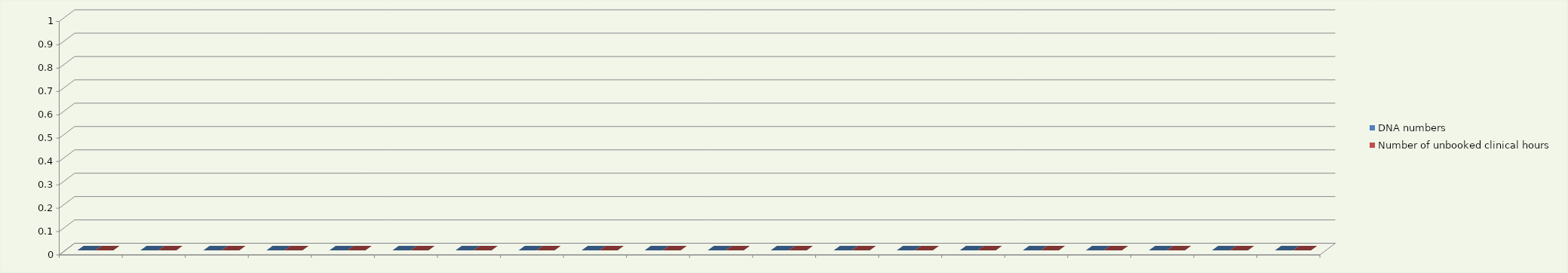
| Category | DNA numbers | Number of unbooked clinical hours |
|---|---|---|
| 0 | 0 | 0 |
| 1 | 0 | 0 |
| 2 | 0 | 0 |
| 3 | 0 | 0 |
| 4 | 0 | 0 |
| 5 | 0 | 0 |
| 6 | 0 | 0 |
| 7 | 0 | 0 |
| 8 | 0 | 0 |
| 9 | 0 | 0 |
| 10 | 0 | 0 |
| 11 | 0 | 0 |
| 12 | 0 | 0 |
| 13 | 0 | 0 |
| 14 | 0 | 0 |
| 15 | 0 | 0 |
| 16 | 0 | 0 |
| 17 | 0 | 0 |
| 18 | 0 | 0 |
| 19 | 0 | 0 |